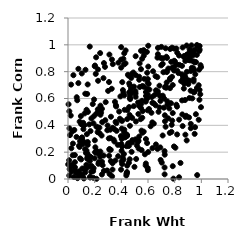
| Category | Series 0 |
|---|---|
| 0.9206579963663208 | 0.805 |
| 0.4158077181605829 | 0.641 |
| 0.3120428770809936 | 0.037 |
| 0.8353106009330821 | 0.851 |
| 0.7339869307414821 | 0.691 |
| 0.21308055101903886 | 0.39 |
| 0.28270051747507824 | 0.573 |
| 0.9456667624345371 | 0.811 |
| 0.08271187156841116 | 0.248 |
| 0.3836603406586898 | 0.503 |
| 0.5448585949675732 | 0.446 |
| 0.7635212476554524 | 0.343 |
| 0.5504686050921789 | 0.561 |
| 0.4056419928539269 | 0.241 |
| 0.48161962206379433 | 0.785 |
| 0.4021259850755091 | 0.21 |
| 0.7273541224507231 | 0.43 |
| 0.2598293609247199 | 0.103 |
| 0.8530634626550466 | 0.78 |
| 0.45638774144367006 | 0.246 |
| 0.30821040089644225 | 0.173 |
| 0.7743683591543493 | 0.873 |
| 0.46207957422139495 | 0.477 |
| 0.23543787546274828 | 0.191 |
| 0.9670457039037931 | 0.679 |
| 0.4400476172596531 | 0.039 |
| 0.4431681908915374 | 0.321 |
| 0.23539181364033687 | 0.383 |
| 0.22451633668062942 | 0.384 |
| 0.4222119321072056 | 0.368 |
| 0.7659264997425803 | 0.969 |
| 0.943451809159553 | 0.646 |
| 0.1052541292295466 | 0.31 |
| 0.9285462002775313 | 0.829 |
| 0.5384748120413075 | 0.686 |
| 0.09922966054547953 | 0.409 |
| 0.949910518939072 | 0.869 |
| 0.20065670655835888 | 0.84 |
| 0.20310304100490315 | 0.2 |
| 0.8194285080062899 | 0.806 |
| 0.5844049880543402 | 0.298 |
| 0.4245124199888307 | 0.516 |
| 0.7957365921333248 | 0.881 |
| 0.5113162440353053 | 0.149 |
| 0.3892200685994344 | 0.449 |
| 0.22201160205907025 | 0.349 |
| 0.993907332759356 | 0.848 |
| 0.5468281498382376 | 0.529 |
| 0.7265102340048437 | 0.475 |
| 0.42182547996855874 | 0.937 |
| 0.9105993135475782 | 0.604 |
| 0.213982639319976 | 0.211 |
| 0.45675928131970034 | 0.121 |
| 0.6337600474479511 | 0.23 |
| 0.3308143528940674 | 0.02 |
| 0.17433334105003712 | 0.053 |
| 0.4629848237053344 | 0.147 |
| 0.465089344490737 | 0.604 |
| 0.9150889705289293 | 0.934 |
| 0.5512959611973434 | 0.36 |
| 0.4782303546606073 | 0.643 |
| 0.8705799180205531 | 0.917 |
| 0.2277124982287225 | 0.189 |
| 0.01112948284223116 | 0.378 |
| 0.05082214313926906 | 0.065 |
| 0.7855892328342527 | 0.492 |
| 0.876214572791075 | 0.765 |
| 0.5985813824788243 | 0.745 |
| 0.5939450579727724 | 0.792 |
| 0.15911137667687214 | 0.407 |
| 0.871272367851718 | 0.711 |
| 0.06389019896030526 | 0.313 |
| 0.7648062874689028 | 0.749 |
| 0.023321956539000453 | 0.704 |
| 0.3470115873342328 | 0.372 |
| 0.4431112977337718 | 0.328 |
| 0.4718060592533276 | 0.668 |
| 0.7792253778191666 | 0.827 |
| 0.12958702128835503 | 0.049 |
| 0.24168110020162487 | 0.166 |
| 0.10893347105673439 | 0.023 |
| 0.8910697622226316 | 0.799 |
| 0.37617730925346315 | 0.17 |
| 0.1996728586670031 | 0.154 |
| 0.7254110164333968 | 0.181 |
| 0.15147871556221507 | 0.17 |
| 0.9504573136855049 | 0.963 |
| 0.1352611008309799 | 0.193 |
| 0.39672147773410876 | 0.32 |
| 0.538240381553302 | 0.569 |
| 0.11910773708450931 | 0.004 |
| 0.9423875325477266 | 0.743 |
| 0.46391360395979586 | 0.697 |
| 0.8130478310451714 | 0.972 |
| 0.3207285795626817 | 0.217 |
| 0.9661767191671596 | 0.925 |
| 0.29467048754694347 | 0.363 |
| 0.4660287046007808 | 0.595 |
| 0.32213281223442497 | 0.464 |
| 0.464483341374274 | 0.623 |
| 0.08434316095264624 | 0.057 |
| 0.5570111082573587 | 0.457 |
| 0.0013983276838097289 | 0.109 |
| 0.9801957261488091 | 0.699 |
| 0.77238509620792 | 0.565 |
| 0.8185539464837522 | 0.332 |
| 0.7961214594318241 | 0.808 |
| 0.5915672727278681 | 0.597 |
| 0.4207207834494755 | 0.348 |
| 0.008671611902048957 | 0.14 |
| 0.9076809227668415 | 0.459 |
| 0.5973254152104879 | 0.717 |
| 0.780407533987411 | 0.979 |
| 0.7453705278236127 | 0.579 |
| 0.9545694579969923 | 0.781 |
| 0.41908205053970743 | 0.186 |
| 0.028572492882195547 | 0.056 |
| 0.5055852287548122 | 0.655 |
| 0.26714268041988587 | 0.175 |
| 0.188762867013501 | 0.058 |
| 0.5934806583749638 | 0.268 |
| 0.24109285320952015 | 0.938 |
| 0.3550657296688981 | 0.138 |
| 0.1392213864366592 | 0.516 |
| 0.6860443283646659 | 0.695 |
| 0.7976810002735821 | 0.839 |
| 0.6931102946344303 | 0.582 |
| 0.9372300836659356 | 0.943 |
| 0.047436343731645805 | 0.365 |
| 0.1686045664436286 | 0.357 |
| 0.07773162321682887 | 0.715 |
| 0.6502205833137428 | 0.626 |
| 0.16388107222321982 | 0.134 |
| 0.5916074672103301 | 0.947 |
| 0.35937850822188167 | 0.55 |
| 0.5073067200827881 | 0.915 |
| 0.36444032194835047 | 0.359 |
| 0.7192081990578212 | 0.532 |
| 0.9868696673002595 | 0.664 |
| 0.7855783872839376 | 0.7 |
| 0.7652555576892625 | 0.677 |
| 0.776165934141316 | 0.351 |
| 0.35228363453854306 | 0.575 |
| 0.5475645310159162 | 0.819 |
| 0.633040521982832 | 0.568 |
| 0.3418507172043201 | 0.293 |
| 0.9919981623937305 | 0.631 |
| 0.8902206409227389 | 0.287 |
| 0.11946615598448743 | 0.076 |
| 0.014706523977364133 | 0.327 |
| 0.3482252125675912 | 0.279 |
| 0.05156671501705661 | 0.178 |
| 0.10430662320487442 | 0.031 |
| 0.5832718326707551 | 0.577 |
| 0.11552126947045749 | 0.372 |
| 0.47119522743714926 | 0.461 |
| 0.73743510612054 | 0.802 |
| 0.790652566889027 | 0.003 |
| 0.8722488884327231 | 0.726 |
| 0.8551936512262877 | 0.843 |
| 0.16608359542920462 | 0.011 |
| 0.6699656102208051 | 0.759 |
| 0.22355861151065476 | 0.519 |
| 0.5335369972331315 | 0.762 |
| 0.7239735480127207 | 0.208 |
| 0.01242114049879411 | 0.074 |
| 0.11399079384010528 | 0.419 |
| 0.8597936148239469 | 0.98 |
| 0.05174462197871446 | 0.126 |
| 0.9261837409893687 | 0.996 |
| 0.5476247493034484 | 0.955 |
| 0.5966442560685067 | 0.607 |
| 0.8176953290144803 | 0.539 |
| 0.3113626856784867 | 0.223 |
| 0.41518312664218365 | 0.896 |
| 0.828466058964925 | 0.789 |
| 0.44400986097414835 | 0.1 |
| 0.19077291116862613 | 0.415 |
| 0.9857452448741214 | 0.591 |
| 0.3629446221023996 | 0.417 |
| 0.04059397370999288 | 0.774 |
| 0.833513774909527 | 0.442 |
| 0.00949074450988487 | 0.026 |
| 0.8991664953540845 | 0.736 |
| 0.45917447784559895 | 0.713 |
| 0.567790546217495 | 0.353 |
| 0.25486612900514477 | 0.129 |
| 0.7100086873464799 | 0.324 |
| 0.8486050718433689 | 0.729 |
| 0.5072686861812367 | 0.613 |
| 0.4514125281295127 | 0.265 |
| 0.035258049893647316 | 0.177 |
| 0.14881695883233734 | 0.182 |
| 0.2544600397124745 | 0.034 |
| 0.24282285512297874 | 0.205 |
| 0.03313562704283693 | 0.354 |
| 0.10384617373136162 | 0.302 |
| 0.20817430101732778 | 0.783 |
| 0.601839856168552 | 0.838 |
| 0.9030839541253202 | 0.888 |
| 0.30762320166936974 | 0.723 |
| 0.1345953510054321 | 0.271 |
| 0.8686235899519622 | 0.674 |
| 0.5291100003794487 | 0.285 |
| 0.4401346430826675 | 0.042 |
| 0.13760687766853316 | 0.106 |
| 0.4282246540133211 | 0.315 |
| 0.029033800279547956 | 0.106 |
| 0.9321137079429141 | 0.601 |
| 0.1855814386240499 | 0.558 |
| 0.07971540379036841 | 0.02 |
| 0.2255815960989776 | 0.732 |
| 0.9531098551068639 | 0.386 |
| 0.5165390090018145 | 0.25 |
| 0.5985806582909211 | 0.512 |
| 0.9067126751497371 | 0.936 |
| 0.4374387231984106 | 0.026 |
| 0.5850731509307061 | 0.619 |
| 0.2522389919843574 | 0.324 |
| 0.6919926908393915 | 0.235 |
| 0.020789694825383714 | 0.088 |
| 0.8803266171534851 | 0.33 |
| 0.45839233795772527 | 0.536 |
| 0.859748807996846 | 0.394 |
| 0.07793085686396868 | 0.821 |
| 0.9119936054350752 | 0.885 |
| 0.7458391047432884 | 0.555 |
| 0.010131367339377554 | 0.505 |
| 0.1311258255084955 | 0.814 |
| 0.6257990167693787 | 0.494 |
| 0.24259745923959905 | 0.526 |
| 0.13640831368471298 | 0.077 |
| 0.12792530246459943 | 0.222 |
| 0.6597232990980351 | 0.661 |
| 0.1248874718033443 | 0.489 |
| 0.6594583139827579 | 0.257 |
| 0.09068123108904709 | 0.154 |
| 0.7032388616892022 | 0.122 |
| 0.9182616481753186 | 0.957 |
| 0.6381316520127092 | 0.803 |
| 0.5296275658964578 | 0.227 |
| 0.9105090175069699 | 0.733 |
| 0.4425435414763776 | 0.052 |
| 0.0866948743139844 | 0.239 |
| 0.14123030872942785 | 0.194 |
| 0.40604260128188824 | 0.111 |
| 0.17593335363351154 | 0.097 |
| 0.10671178940783553 | 0.405 |
| 0.8332513183664992 | 0.013 |
| 0.07159536624132712 | 0.006 |
| 0.5843928676573507 | 0.648 |
| 0.14944804154111227 | 0.5 |
| 0.7243217582553553 | 0.086 |
| 0.10230535087278184 | 0.307 |
| 0.5683811143086209 | 0.95 |
| 0.1437617036100868 | 0.634 |
| 0.7855983068391169 | 0.096 |
| 0.2021412746206983 | 0.846 |
| 0.8798821942164814 | 0.88 |
| 0.6292569843384186 | 0.61 |
| 0.6746347049807131 | 0.977 |
| 0.7421063605363283 | 0.902 |
| 0.4771846751334685 | 0.202 |
| 0.9499151368108258 | 0.336 |
| 0.16300788346144007 | 0.093 |
| 0.3998251970516201 | 0.436 |
| 0.777720939244854 | 0.404 |
| 0.8556736177022598 | 0.586 |
| 0.643419228487848 | 0.564 |
| 0.8600180471936898 | 0.738 |
| 0.5255871449472829 | 0.57 |
| 0.4033472744368696 | 0.298 |
| 0.5992613074361208 | 0.066 |
| 0.4493633143214666 | 0.777 |
| 0.8165725938891432 | 0.854 |
| 0.20109473789649027 | 0.289 |
| 0.8125536610122756 | 0.554 |
| 0.9596028060143798 | 0.871 |
| 0.22451012079057556 | 0.817 |
| 0.5678329438056692 | 0.96 |
| 0.3213235003286398 | 0.134 |
| 0.1458538282528606 | 0.161 |
| 0.45882697701397085 | 0.646 |
| 0.8989530230667316 | 0.892 |
| 0.4395929888158241 | 0.245 |
| 0.2247103229168587 | 0.497 |
| 0.6075230161149807 | 0.521 |
| 0.8807904000166021 | 0.463 |
| 0.6709443839747424 | 0.224 |
| 0.22792700392140208 | 0.113 |
| 0.07218151176010766 | 0.045 |
| 0.6947789996579377 | 0.142 |
| 0.7529692559600895 | 0.823 |
| 0.3357804640401062 | 0.381 |
| 0.5333756241231657 | 0.545 |
| 0.4437611902699906 | 0.446 |
| 0.3930282536546783 | 0.615 |
| 0.3979048339256537 | 0.07 |
| 0.9843431064360492 | 0.954 |
| 0.10705634807216055 | 0.078 |
| 0.5068506320411539 | 0.296 |
| 0.7107482012018417 | 0.621 |
| 0.8864765090671368 | 0.471 |
| 0.19310792554419803 | 0.467 |
| 0.06131953134036935 | 0.046 |
| 0.5685359872448764 | 0.919 |
| 0.7375689873592028 | 0.911 |
| 0.6018575039176264 | 0.993 |
| 0.6710106002684412 | 0.905 |
| 0.3984367131045802 | 0.89 |
| 0.5581555108955356 | 0.693 |
| 0.49328177648781885 | 0.543 |
| 0.7320139701004647 | 0.39 |
| 0.31872583789119574 | 0.305 |
| 0.9688941262517016 | 0.029 |
| 0.7247219801035383 | 0.035 |
| 0.8779527885614529 | 0.589 |
| 0.2774300906929792 | 0.836 |
| 0.8898728701923683 | 0.995 |
| 0.10828657290868919 | 0.259 |
| 0.26926839993949303 | 0.06 |
| 0.5721598136781618 | 0.746 |
| 0.19559308118333968 | 0.593 |
| 0.5338910286595773 | 0.316 |
| 0.6015711562240776 | 0.201 |
| 0.42156888217372457 | 0.624 |
| 0.05290609104027257 | 0.087 |
| 0.3105308120922005 | 0.927 |
| 0.6050480853201528 | 0.709 |
| 0.7367857562721403 | 0.68 |
| 0.9973785953215607 | 0.535 |
| 0.3987237573573671 | 0.983 |
| 0.2140654445466696 | 0.001 |
| 0.6434311408650671 | 0.413 |
| 0.08735828305670115 | 0.428 |
| 0.30603708744686237 | 0.302 |
| 0.06920817314970357 | 0.587 |
| 0.6998727914544386 | 0.985 |
| 0.9416386504848361 | 0.95 |
| 0.21183938293747623 | 0.486 |
| 0.12318853674436775 | 0.401 |
| 0.40046042973019474 | 0.261 |
| 0.20878297190945366 | 0.196 |
| 0.5560577484183308 | 0.896 |
| 0.19042617453663588 | 0.009 |
| 0.37806561269244426 | 0.867 |
| 0.7971104824271442 | 0.972 |
| 0.09667408300183457 | 0.469 |
| 0.14761963869336864 | 0.705 |
| 0.23107940176842498 | 0.126 |
| 0.4278539899351959 | 0.31 |
| 0.4035415102201154 | 0.375 |
| 0.5578371055817327 | 0.345 |
| 0.14835988267168787 | 0.275 |
| 0.9152554220606132 | 0.913 |
| 0.6566507129306031 | 0.767 |
| 0.1111541160748035 | 0.283 |
| 0.2350126373179629 | 0.508 |
| 0.6197458727582099 | 0.393 |
| 0.46230128930470926 | 0.268 |
| 0.857302783390963 | 0.481 |
| 0.6988826040146613 | 0.847 |
| 0.06547824833566235 | 0.61 |
| 0.1485332897872813 | 0.157 |
| 0.5337113318749944 | 0.74 |
| 0.41991523633904815 | 0.854 |
| 0.09051084717383218 | 0.281 |
| 0.360911577693665 | 0.541 |
| 0.16989027511938645 | 0.163 |
| 0.5945398608982372 | 0.672 |
| 0.6791179847356325 | 0.501 |
| 0.9169918781309558 | 0.945 |
| 0.40697378166658293 | 0.722 |
| 0.31640630739219944 | 0.368 |
| 0.9873847725314978 | 0.964 |
| 0.7949081254876003 | 0.242 |
| 0.4809704683352254 | 0.455 |
| 0.49018471693493165 | 0.793 |
| 0.5373404972083116 | 0.861 |
| 0.20514011664655846 | 0.236 |
| 0.8721010315390538 | 0.771 |
| 0.7512356976599788 | 0.452 |
| 0.7818792870094639 | 0.435 |
| 0.33602055398433667 | 0.856 |
| 0.57686004894217 | 0.184 |
| 0.6324443401991671 | 0.422 |
| 0.9389168791254736 | 0.924 |
| 0.8436919551063009 | 0.12 |
| 0.8801145311033335 | 0.757 |
| 0.9868935682931985 | 0.991 |
| 0.8019549938107934 | 0.876 |
| 0.805542409047916 | 0.233 |
| 0.9210878394301889 | 0.378 |
| 0.780229665364891 | 0.762 |
| 0.4945772727358627 | 0.689 |
| 0.715509408082112 | 0.796 |
| 0.7403156205012983 | 0.719 |
| 0.0815314129512775 | 0.041 |
| 0.49842804561322207 | 0.091 |
| 0.5075584520303256 | 0.775 |
| 0.8630736900660995 | 0.755 |
| 0.9121495395272297 | 0.967 |
| 0.29729157440694104 | 0.399 |
| 0.7318790870174974 | 0.974 |
| 0.5278687909257919 | 0.484 |
| 0.9419683058201236 | 0.727 |
| 0.2108691513490548 | 0.907 |
| 0.5684806638559528 | 0.687 |
| 0.5551449547017995 | 0.583 |
| 0.4062632648729113 | 0.434 |
| 0.4018885882445375 | 0.132 |
| 0.3007749248501847 | 0.657 |
| 0.03694296667176091 | 0.264 |
| 0.5237380890701333 | 0.277 |
| 0.6718103285347659 | 0.639 |
| 0.6743673159137573 | 0.93 |
| 0.7213931659252573 | 0.599 |
| 0.9839547939350171 | 0.815 |
| 0.8328205850358149 | 0.921 |
| 0.3568899841513345 | 0.426 |
| 0.7102347140115218 | 0.858 |
| 0.16501140962324554 | 0.016 |
| 0.44522038639957334 | 0.513 |
| 0.6107723370640755 | 0.666 |
| 0.33387018279221353 | 0.118 |
| 0.020565692733179295 | 0.473 |
| 0.29345881442468824 | 0.064 |
| 0.2660118276702779 | 0.752 |
| 0.902305368583397 | 0.707 |
| 0.3988469112783059 | 0.83 |
| 0.9803171530221629 | 0.441 |
| 0.14171651696114293 | 0.334 |
| 0.43234660801805447 | 0.958 |
| 0.431592272406884 | 0.339 |
| 0.8192383852107722 | 0.941 |
| 0.7594983204510785 | 0.526 |
| 0.10339833349059753 | 0.787 |
| 0.5092933125492373 | 0.429 |
| 0.279570338723108 | 0.438 |
| 0.2546832596303336 | 0.523 |
| 0.997781717352732 | 0.834 |
| 0.12942621125441808 | 0.636 |
| 0.6963666871909162 | 0.902 |
| 0.24819880489982227 | 0.495 |
| 0.09881315950276624 | 0.146 |
| 0.43143486517039126 | 0.862 |
| 0.7415368554733555 | 0.797 |
| 0.4555882857805377 | 0.77 |
| 0.2366952742645563 | 0.341 |
| 0.19233110362441352 | 0.08 |
| 0.14414340937282302 | 0.15 |
| 0.5607452889274825 | 0.506 |
| 0.04451352321331888 | 0.015 |
| 0.3278557754548327 | 0.673 |
| 0.970579477218177 | 0.989 |
| 0.13888582242711783 | 0.212 |
| 0.7125476201437916 | 0.899 |
| 0.4645424456450834 | 0.396 |
| 0.25659103609910516 | 0.424 |
| 0.4744230107685663 | 0.753 |
| 0.6872682552613286 | 0.533 |
| 0.5824288259065544 | 0.101 |
| 0.48299072712932756 | 0.273 |
| 0.4830049445585843 | 0.29 |
| 0.9590643493671106 | 0.483 |
| 0.5973896485937951 | 0.082 |
| 0.9670942434352623 | 0.999 |
| 0.5983256536700425 | 0.629 |
| 0.6740889551890756 | 0.652 |
| 0.3734588806432424 | 0.254 |
| 0.31064415719900845 | 0.218 |
| 0.8689994681944615 | 0.909 |
| 0.9208847742666246 | 0.411 |
| 0.8928142241307718 | 0.928 |
| 0.4119620282626743 | 0.663 |
| 0.9201090503972003 | 0.658 |
| 0.1477937695602994 | 0.254 |
| 0.6575067698840201 | 0.549 |
| 0.24360985621237366 | 0.479 |
| 0.7650743514629031 | 0.741 |
| 0.3338614578269154 | 0.071 |
| 0.4161336320940195 | 0.143 |
| 0.1686184283696371 | 0.164 |
| 0.5839529901054299 | 0.116 |
| 0.6907443334189708 | 0.618 |
| 0.24328801061722796 | 0.547 |
| 0.925867809792364 | 0.883 |
| 0.9494908385784541 | 0.65 |
| 0.5068593510902033 | 0.638 |
| 0.004268520867028132 | 0.557 |
| 0.26954984324070463 | 0.864 |
| 0.1752555847083054 | 0.451 |
| 0.9411302065014182 | 0.877 |
| 0.5522694333181991 | 0.215 |
| 0.02497987184166447 | 0.229 |
| 0.1632294678494957 | 0.987 |
| 0.7268889660304179 | 0.683 |
| 0.3297296137202529 | 0.89 |
| 0.9404107383985986 | 0.826 |
| 0.4104427586470252 | 0.16 |